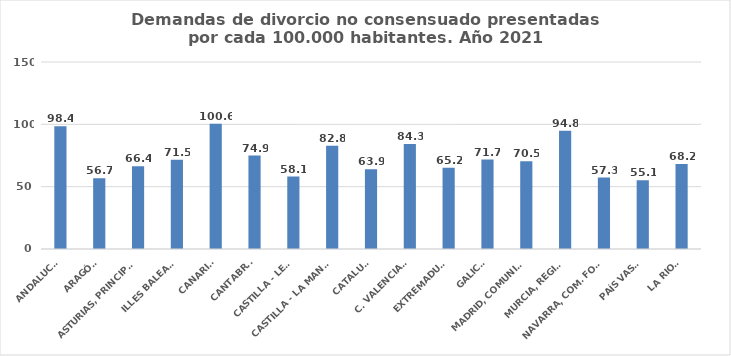
| Category | Series 0 |
|---|---|
| ANDALUCÍA | 98.378 |
| ARAGÓN | 56.701 |
| ASTURIAS, PRINCIPADO | 66.417 |
| ILLES BALEARS | 71.526 |
| CANARIAS | 100.555 |
| CANTABRIA | 74.935 |
| CASTILLA - LEÓN | 58.117 |
| CASTILLA - LA MANCHA | 82.798 |
| CATALUÑA | 63.928 |
| C. VALENCIANA | 84.3 |
| EXTREMADURA | 65.219 |
| GALICIA | 71.745 |
| MADRID, COMUNIDAD | 70.461 |
| MURCIA, REGIÓN | 94.831 |
| NAVARRA, COM. FORAL | 57.291 |
| PAÍS VASCO | 55.149 |
| LA RIOJA | 68.168 |